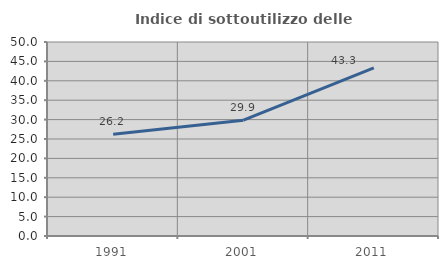
| Category | Indice di sottoutilizzo delle abitazioni  |
|---|---|
| 1991.0 | 26.238 |
| 2001.0 | 29.858 |
| 2011.0 | 43.35 |